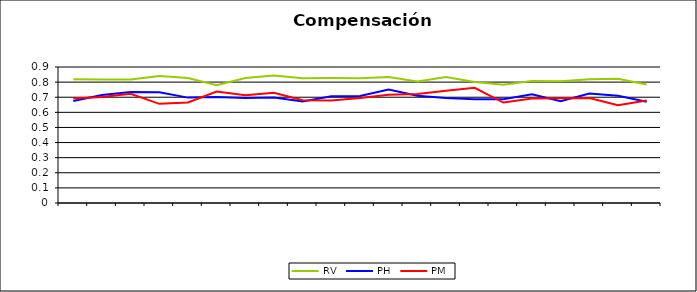
| Category | RV | PH | PM |
|---|---|---|---|
| 0 | 0.819 | 0.675 | 0.691 |
| 1 | 0.818 | 0.714 | 0.701 |
| 2 | 0.817 | 0.734 | 0.722 |
| 3 | 0.84 | 0.732 | 0.656 |
| 4 | 0.827 | 0.697 | 0.666 |
| 5 | 0.78 | 0.701 | 0.737 |
| 6 | 0.827 | 0.695 | 0.713 |
| 7 | 0.844 | 0.699 | 0.73 |
| 8 | 0.826 | 0.672 | 0.68 |
| 9 | 0.827 | 0.706 | 0.678 |
| 10 | 0.826 | 0.709 | 0.696 |
| 11 | 0.834 | 0.751 | 0.717 |
| 12 | 0.804 | 0.709 | 0.721 |
| 13 | 0.834 | 0.694 | 0.743 |
| 14 | 0.802 | 0.687 | 0.763 |
| 15 | 0.783 | 0.687 | 0.665 |
| 16 | 0.807 | 0.72 | 0.692 |
| 17 | 0.805 | 0.674 | 0.693 |
| 18 | 0.82 | 0.724 | 0.695 |
| 19 | 0.822 | 0.71 | 0.646 |
| 20 | 0.784 | 0.67 | 0.678 |